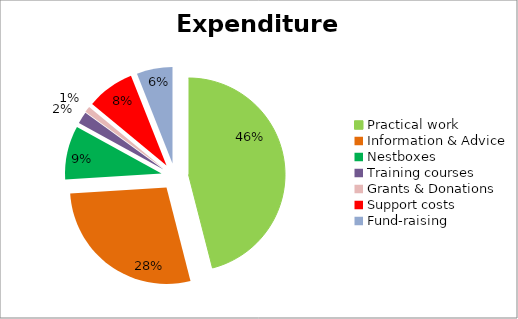
| Category | Series 0 |
|---|---|
| Practical work | 0.46 |
| Information & Advice | 0.28 |
| Nestboxes | 0.09 |
| Training courses | 0.02 |
| Grants & Donations  | 0.01 |
| Support costs | 0.08 |
| Fund-raising | 0.06 |